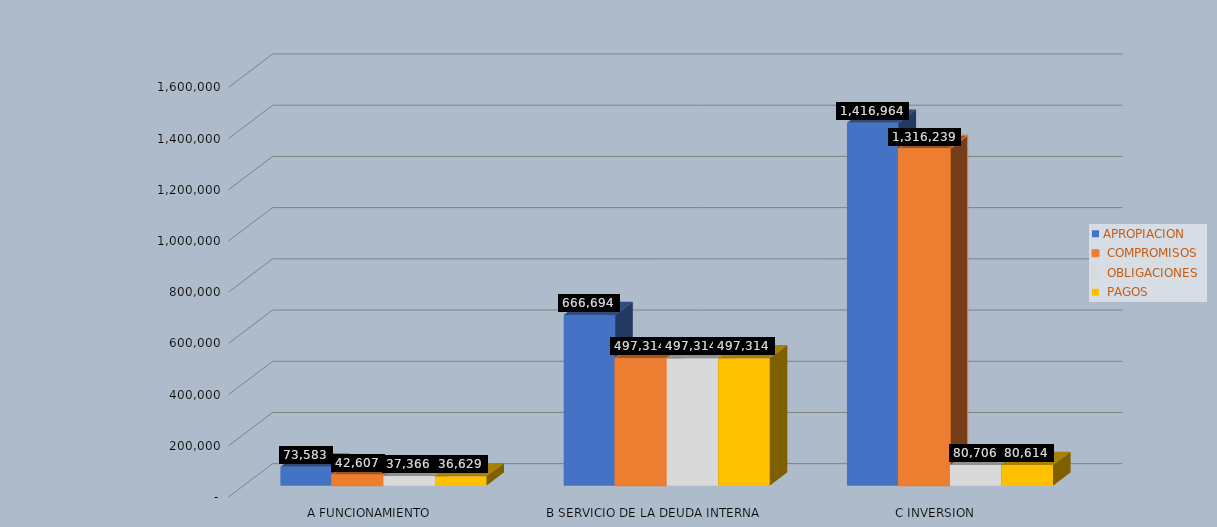
| Category | APROPIACION |  COMPROMISOS |  OBLIGACIONES |  PAGOS |
|---|---|---|---|---|
| A FUNCIONAMIENTO | 73583.024 | 42606.689 | 37365.794 | 36628.557 |
| B SERVICIO DE LA DEUDA INTERNA | 666693.529 | 497313.883 | 497313.883 | 497313.883 |
| C INVERSION | 1416964.092 | 1316238.97 | 80706.078 | 80613.906 |